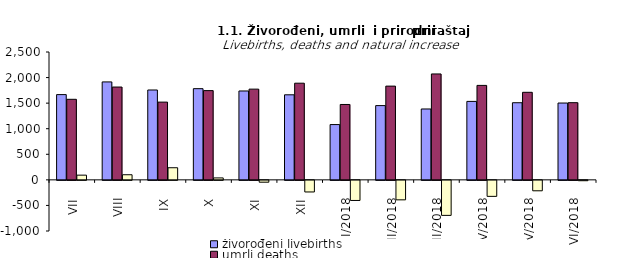
| Category | živorođeni livebirths | umrli deaths | prirodni priraštaj natural increase |
|---|---|---|---|
| VII | 1667 | 1575 | 92 |
| VIII | 1915 | 1815 | 100 |
| IX | 1757 | 1520 | 237 |
| X | 1783 | 1745 | 38 |
| XI | 1738 | 1774 | -36 |
| XII | 1663 | 1890 | -227 |
| I/2018 | 1081 | 1474 | -393 |
| II/2018 | 1452 | 1833 | -381 |
| III/2018 | 1386 | 2071 | -685 |
| IV/2018 | 1534 | 1847 | -313 |
| V/2018 | 1508 | 1712 | -204 |
| VI/2018 | 1502 | 1509 | -7 |